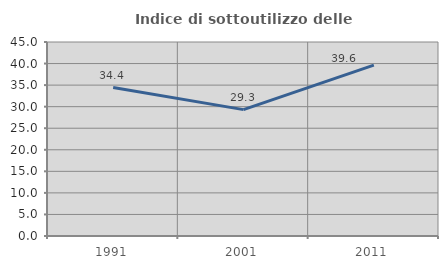
| Category | Indice di sottoutilizzo delle abitazioni  |
|---|---|
| 1991.0 | 34.426 |
| 2001.0 | 29.31 |
| 2011.0 | 39.623 |